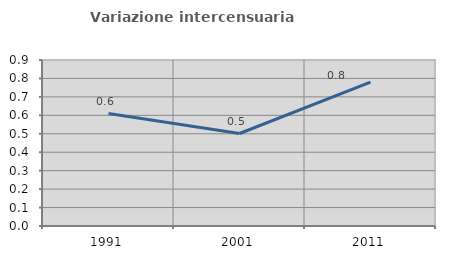
| Category | Variazione intercensuaria annua |
|---|---|
| 1991.0 | 0.61 |
| 2001.0 | 0.502 |
| 2011.0 | 0.78 |